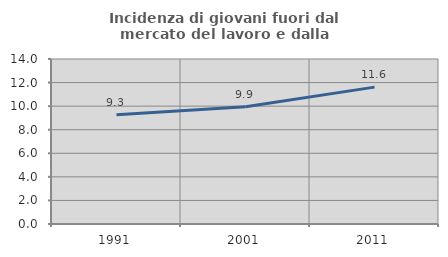
| Category | Incidenza di giovani fuori dal mercato del lavoro e dalla formazione  |
|---|---|
| 1991.0 | 9.268 |
| 2001.0 | 9.945 |
| 2011.0 | 11.613 |